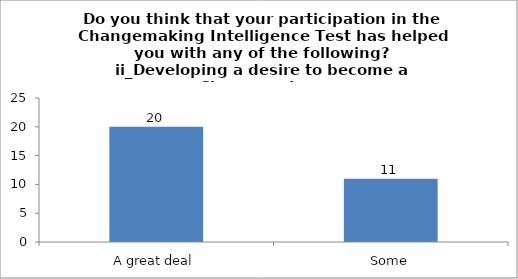
| Category | Do you think that your participation in the Changemaking Intelligence Test has helped you with any of the following?
ii_Developing a desire to become a Changemaker. |
|---|---|
| A great deal | 20 |
| Some | 11 |